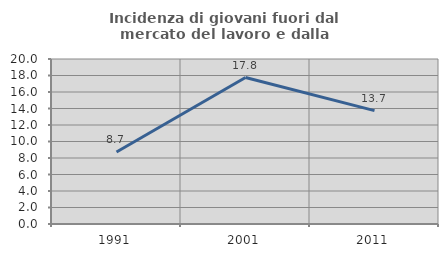
| Category | Incidenza di giovani fuori dal mercato del lavoro e dalla formazione  |
|---|---|
| 1991.0 | 8.735 |
| 2001.0 | 17.753 |
| 2011.0 | 13.742 |